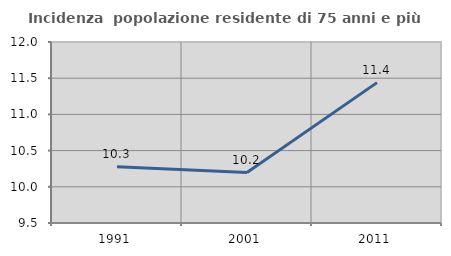
| Category | Incidenza  popolazione residente di 75 anni e più |
|---|---|
| 1991.0 | 10.276 |
| 2001.0 | 10.196 |
| 2011.0 | 11.439 |